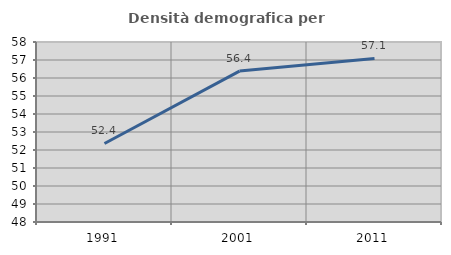
| Category | Densità demografica |
|---|---|
| 1991.0 | 52.361 |
| 2001.0 | 56.383 |
| 2011.0 | 57.085 |